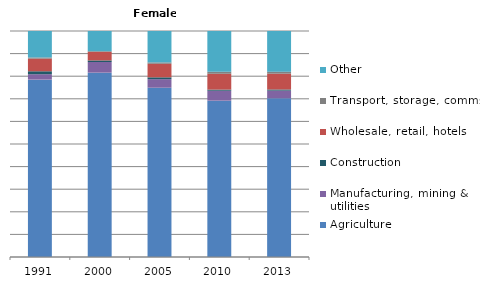
| Category | Agriculture | Manufacturing, mining & utilities | Construction | Wholesale, retail, hotels | Transport, storage, comms | Other |
|---|---|---|---|---|---|---|
| 1991.0 | 78.4 | 2.4 | 1.3 | 5.6 | 0.5 | 11.7 |
| 2000.0 | 81.4 | 4.7 | 0.7 | 3.8 | 0.3 | 8.9 |
| 2005.0 | 74.9 | 3.8 | 0.8 | 6 | 0.6 | 13.9 |
| 2010.0 | 69.1 | 4.4 | 0.5 | 7 | 0.9 | 18 |
| 2013.0 | 70.3 | 3.4 | 0.5 | 7 | 0.9 | 18 |